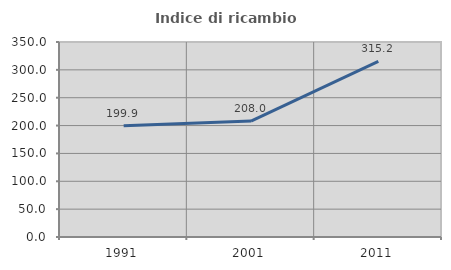
| Category | Indice di ricambio occupazionale  |
|---|---|
| 1991.0 | 199.865 |
| 2001.0 | 207.99 |
| 2011.0 | 315.157 |